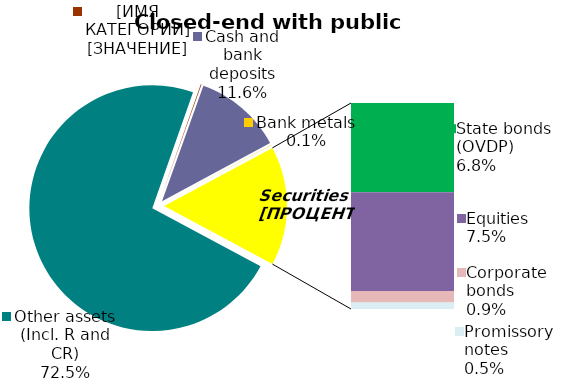
| Category | Series 0 |
|---|---|
| Other assets (Incl. R and CR) | 0.725 |
| Real estate | 0.001 |
| Cash and bank deposits | 0.116 |
| Bank metals | 0.001 |
| State bonds (OVDP) | 0.068 |
| Municipal bonds | 0 |
| Equities | 0.075 |
| Corporate bonds | 0.009 |
| Promissory notes | 0.005 |